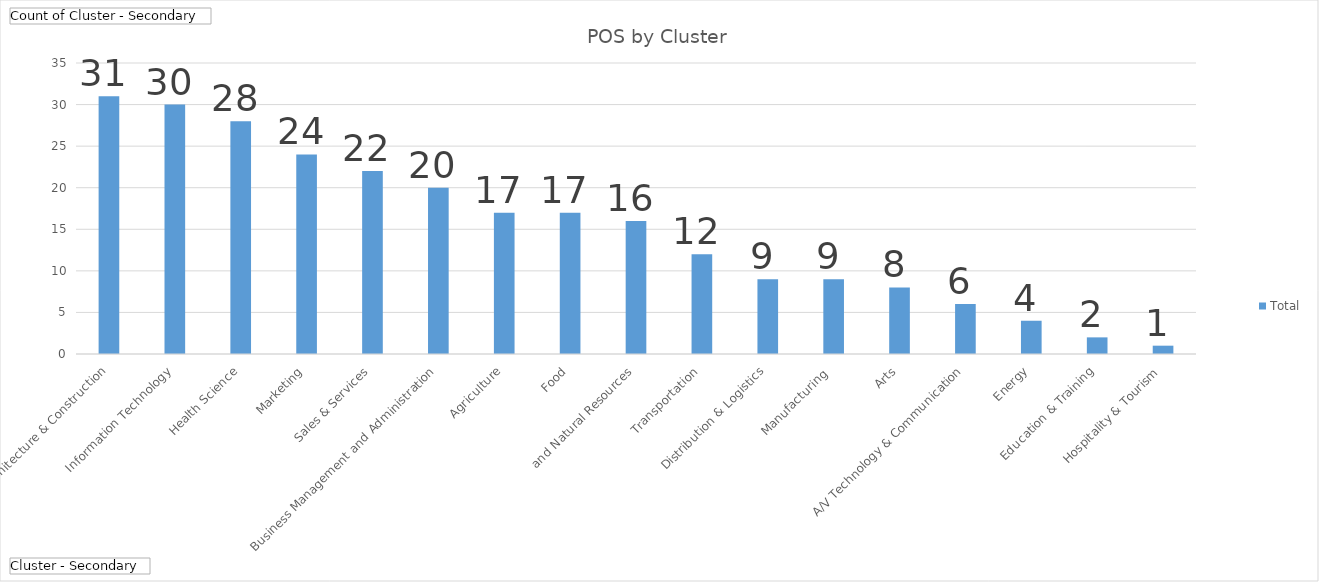
| Category | Total |
|---|---|
| Architecture & Construction | 31 |
| Information Technology | 30 |
| Health Science | 28 |
| Marketing, Sales & Services | 24 |
| Business Management and Administration | 22 |
| Agriculture, Food, and Natural Resources | 20 |
| Transportation, Distribution & Logistics | 17 |
| Manufacturing  | 17 |
| Arts, A/V Technology & Communication | 16 |
| Energy | 12 |
| Education & Training | 9 |
| Hospitality & Tourism | 9 |
| Law, Public Safety & Security  | 8 |
| Engineering and Technology Education | 6 |
| Finance | 4 |
| Government & Public Administration | 2 |
| Manufacturing | 1 |